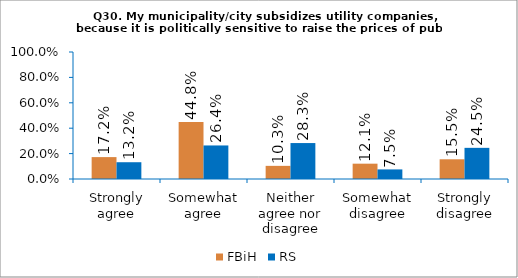
| Category | FBiH | RS |
|---|---|---|
| Strongly agree | 0.172 | 0.132 |
| Somewhat agree | 0.448 | 0.264 |
| Neither agree nor disagree | 0.103 | 0.283 |
| Somewhat disagree | 0.121 | 0.075 |
| Strongly disagree | 0.155 | 0.245 |